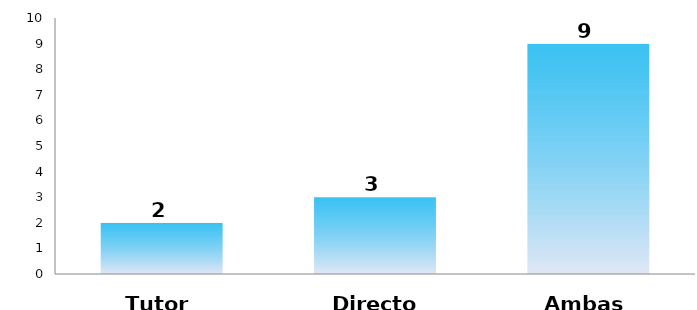
| Category | Series 0 |
|---|---|
| Tutor | 2 |
| Director | 3 |
| Ambas | 9 |